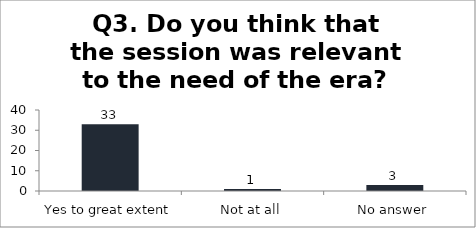
| Category | Q3. Do you think that the session was relevant to the need of the era? |
|---|---|
| Yes to great extent | 33 |
| Not at all | 1 |
| No answer | 3 |